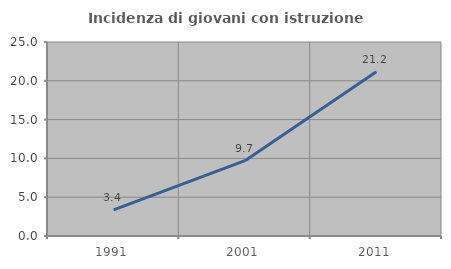
| Category | Incidenza di giovani con istruzione universitaria |
|---|---|
| 1991.0 | 3.371 |
| 2001.0 | 9.709 |
| 2011.0 | 21.176 |